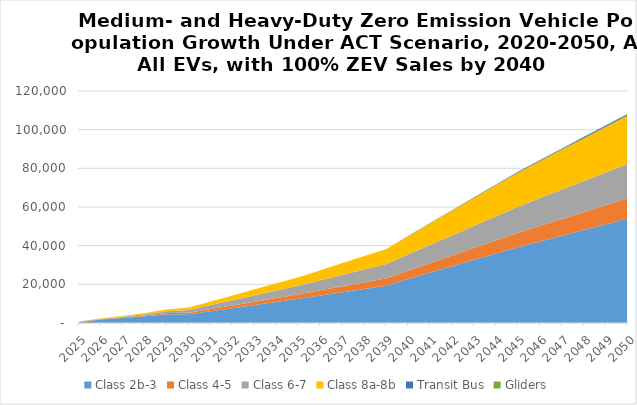
| Category | Class 2b-3 | Class 4-5 | Class 6-7 | Class 8a-8b | Transit Bus | Gliders |
|---|---|---|---|---|---|---|
| 2025.0 | 431.366 | 73.928 | 114.891 | 108.631 | 0 | 0 |
| 2026.0 | 1805.495 | 157.301 | 253.574 | 231.092 | 0 | 0 |
| 2027.0 | 2591.171 | 256.162 | 428.032 | 375.359 | 0 | 0 |
| 2028.0 | 3507.893 | 388.218 | 671.948 | 554.822 | 0 | 0 |
| 2029.0 | 4574.618 | 560.387 | 1004.094 | 779.229 | 0 | 0 |
| 2030.0 | 4480.434 | 790.883 | 1466.116 | 1248.026 | 0 | 0 |
| 2031.0 | 6082.271 | 1107.581 | 2073.432 | 1868.212 | 0 | 0 |
| 2032.0 | 7684.108 | 1424.279 | 2680.749 | 2488.398 | 0 | 0 |
| 2033.0 | 9285.945 | 1740.978 | 3288.065 | 3108.584 | 0 | 0 |
| 2034.0 | 10887.782 | 2057.676 | 3895.381 | 3728.771 | 0 | 0 |
| 2035.0 | 12489.619 | 2374.374 | 4502.697 | 4348.957 | 0 | 0 |
| 2036.0 | 14196.638 | 2736.706 | 5222.496 | 5188.464 | 0 | 0 |
| 2037.0 | 15903.657 | 3099.039 | 5942.295 | 6027.971 | 0 | 0 |
| 2038.0 | 17610.676 | 3461.371 | 6662.094 | 6867.479 | 0 | 0 |
| 2039.0 | 19317.695 | 3823.703 | 7381.892 | 7706.986 | 0 | 0 |
| 2040.0 | 22806.655 | 4356.41 | 8432.594 | 9450.407 | 57.299 | 29.499 |
| 2041.0 | 26092.49 | 4983.812 | 9435.644 | 11103.99 | 117.103 | 58.378 |
| 2042.0 | 29378.326 | 5611.213 | 10438.693 | 12757.573 | 176.907 | 87.257 |
| 2043.0 | 32664.161 | 6238.615 | 11441.743 | 14411.156 | 236.711 | 116.136 |
| 2044.0 | 35949.997 | 6866.017 | 12444.792 | 16064.739 | 296.515 | 145.015 |
| 2045.0 | 39235.832 | 7493.419 | 13447.842 | 17718.322 | 356.319 | 173.895 |
| 2046.0 | 42193.817 | 8099.686 | 14320.722 | 19184.081 | 420.218 | 201.602 |
| 2047.0 | 45151.801 | 8705.953 | 15193.602 | 20649.84 | 484.118 | 229.31 |
| 2048.0 | 48109.785 | 9312.22 | 16066.482 | 22115.598 | 548.017 | 257.018 |
| 2049.0 | 51067.77 | 9918.488 | 16939.362 | 23581.357 | 611.917 | 284.725 |
| 2050.0 | 54025.754 | 10524.755 | 17812.242 | 25047.116 | 675.816 | 312.433 |